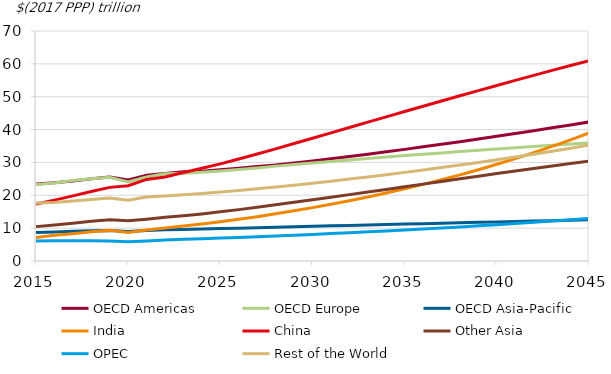
| Category | OECD Americas | OECD Europe | OECD Asia-Pacific | India | China | Other Asia | OPEC | Rest of the World |
|---|---|---|---|---|---|---|---|---|
| 2015.0 | 23.416 | 23.255 | 8.709 | 7.186 | 17.338 | 10.462 | 6.101 | 17.633 |
| 2016.0 | 23.815 | 23.75 | 8.859 | 7.835 | 18.526 | 10.938 | 6.2 | 17.772 |
| 2017.0 | 24.349 | 24.501 | 9.058 | 8.313 | 19.813 | 11.496 | 6.168 | 18.254 |
| 2018.0 | 25.041 | 25.018 | 9.208 | 8.918 | 21.151 | 12.065 | 6.169 | 18.753 |
| 2019.0 | 25.537 | 25.451 | 9.281 | 9.319 | 22.409 | 12.564 | 6.12 | 19.194 |
| 2020.0 | 24.635 | 24.091 | 9.001 | 8.705 | 22.912 | 12.246 | 5.823 | 18.464 |
| 2021.0 | 26.075 | 25.583 | 9.311 | 9.425 | 24.837 | 12.724 | 6.05 | 19.492 |
| 2022.0 | 26.665 | 26.56 | 9.501 | 10.057 | 25.582 | 13.306 | 6.389 | 19.77 |
| 2023.0 | 27.137 | 26.727 | 9.617 | 10.619 | 26.915 | 13.79 | 6.599 | 20.133 |
| 2024.0 | 27.326 | 26.992 | 9.729 | 11.245 | 28.207 | 14.317 | 6.792 | 20.539 |
| 2025.0 | 27.736 | 27.37 | 9.856 | 11.942 | 29.561 | 14.961 | 6.982 | 20.996 |
| 2026.0 | 28.235 | 27.835 | 9.994 | 12.695 | 31.039 | 15.635 | 7.185 | 21.486 |
| 2027.0 | 28.771 | 28.336 | 10.134 | 13.495 | 32.56 | 16.354 | 7.4 | 22.004 |
| 2028.0 | 29.242 | 28.875 | 10.278 | 14.358 | 34.123 | 17.106 | 7.622 | 22.511 |
| 2029.0 | 29.839 | 29.366 | 10.419 | 15.275 | 35.745 | 17.867 | 7.855 | 23.08 |
| 2030.0 | 30.466 | 29.845 | 10.559 | 16.245 | 37.375 | 18.637 | 8.096 | 23.672 |
| 2031.0 | 31.119 | 30.312 | 10.698 | 17.271 | 39.008 | 19.416 | 8.346 | 24.287 |
| 2032.0 | 31.799 | 30.769 | 10.836 | 18.354 | 40.637 | 20.203 | 8.605 | 24.925 |
| 2033.0 | 32.503 | 31.215 | 10.972 | 19.496 | 42.26 | 20.995 | 8.873 | 25.585 |
| 2034.0 | 33.228 | 31.65 | 11.106 | 20.7 | 43.875 | 21.792 | 9.15 | 26.266 |
| 2035.0 | 33.974 | 32.074 | 11.24 | 21.971 | 45.486 | 22.593 | 9.437 | 26.969 |
| 2036.0 | 34.739 | 32.491 | 11.372 | 23.312 | 47.09 | 23.395 | 9.734 | 27.694 |
| 2037.0 | 35.522 | 32.901 | 11.504 | 24.726 | 48.685 | 24.199 | 10.042 | 28.439 |
| 2038.0 | 36.321 | 33.307 | 11.635 | 26.214 | 50.275 | 25.002 | 10.361 | 29.206 |
| 2039.0 | 37.134 | 33.706 | 11.765 | 27.781 | 51.855 | 25.802 | 10.691 | 29.995 |
| 2040.0 | 37.96 | 34.098 | 11.895 | 29.428 | 53.422 | 26.597 | 11.035 | 30.808 |
| 2041.0 | 38.801 | 34.483 | 12.023 | 31.158 | 54.973 | 27.385 | 11.393 | 31.646 |
| 2042.0 | 39.655 | 34.859 | 12.153 | 32.974 | 56.504 | 28.162 | 11.765 | 32.511 |
| 2043.0 | 40.525 | 35.226 | 12.282 | 34.881 | 58.013 | 28.928 | 12.153 | 33.405 |
| 2044.0 | 41.412 | 35.583 | 12.413 | 36.883 | 59.497 | 29.678 | 12.558 | 34.331 |
| 2045.0 | 42.318 | 35.931 | 12.544 | 38.987 | 60.952 | 30.411 | 12.982 | 35.294 |